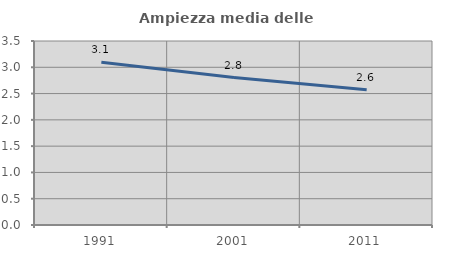
| Category | Ampiezza media delle famiglie |
|---|---|
| 1991.0 | 3.095 |
| 2001.0 | 2.805 |
| 2011.0 | 2.574 |